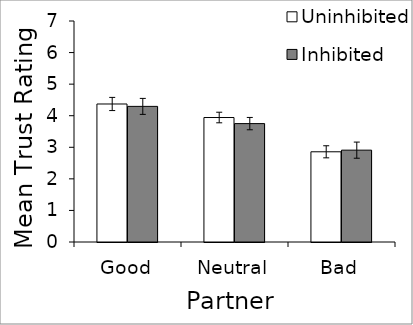
| Category | Uninhibited | Inhibited |
|---|---|---|
| Good | 4.371 | 4.295 |
| Neutral | 3.943 | 3.75 |
| Bad | 2.857 | 2.909 |